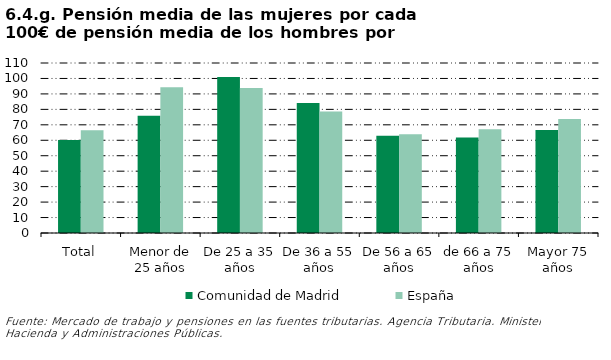
| Category | Comunidad de Madrid | España |
|---|---|---|
| Total | 60.252 | 66.515 |
| Menor de 25 años | 75.817 | 94.256 |
| De 25 a 35 años | 100.946 | 93.756 |
| De 36 a 55 años | 84.1 | 78.688 |
| De 56 a 65 años | 63.003 | 63.854 |
| de 66 a 75 años | 61.796 | 67.104 |
| Mayor 75 años | 66.649 | 73.74 |